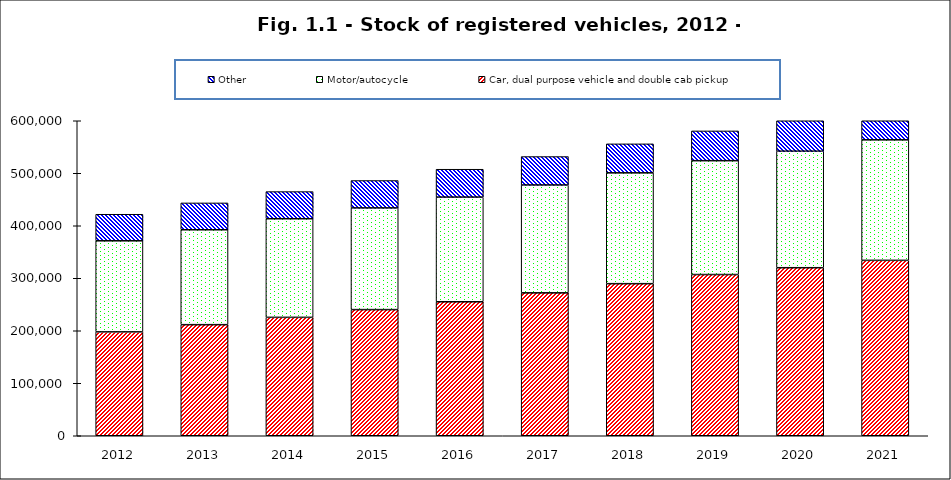
| Category | Car, dual purpose vehicle and double cab pickup | Motor/autocycle | Other |
|---|---|---|---|
| 2012.0 | 197849 | 173508 | 50569 |
| 2013.0 | 211586 | 180785 | 51124 |
| 2014.0 | 225522 | 187851 | 51679 |
| 2015.0 | 240289 | 193688 | 52167 |
| 2016.0 | 255199 | 199399 | 53078 |
| 2017.0 | 272213 | 205493 | 54091 |
| 2018.0 | 289676 | 211125 | 55200 |
| 2019.0 | 307081 | 216863 | 56685 |
| 2020.0 | 320064 | 221988 | 58001 |
| 2021.0 | 334104 | 229563 | 59321 |